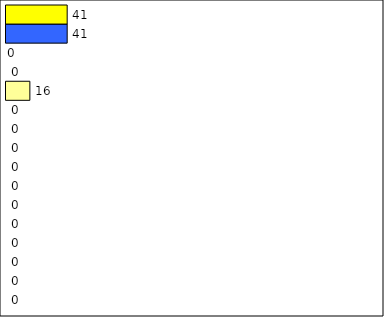
| Category | -2 | -1 | 0 | 1 | 2 | 3 | 4 | 5 | 6 | 7 | 8 | 9 | 10 | 11 | 12 | Perfect Round |
|---|---|---|---|---|---|---|---|---|---|---|---|---|---|---|---|---|
| 0 | 0 | 0 | 0 | 0 | 0 | 0 | 0 | 0 | 0 | 0 | 0 | 16 | 0 | 0 | 41 | 41 |